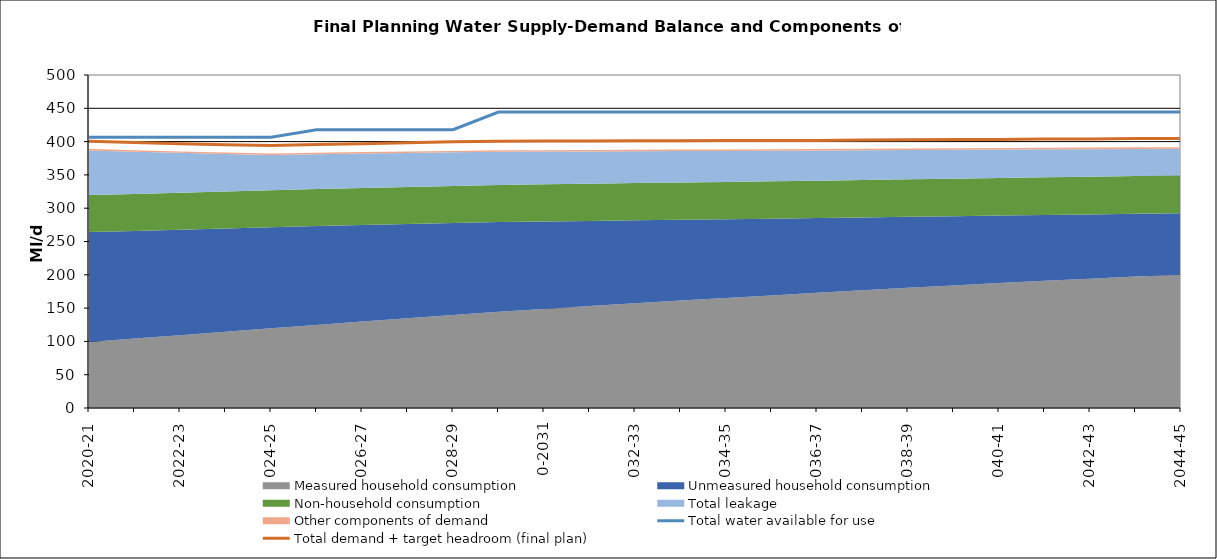
| Category | Total water available for use | Total demand + target headroom (final plan) |
|---|---|---|
| 0 | 406.688 | 400.59 |
| 1 | 406.688 | 398.657 |
| 2 | 406.688 | 396.804 |
| 3 | 406.688 | 395.209 |
| 4 | 406.688 | 394.076 |
| 5 | 417.86 | 395.615 |
| 6 | 417.86 | 396.867 |
| 7 | 417.86 | 398.274 |
| 8 | 417.86 | 399.6 |
| 9 | 444.402 | 400.622 |
| 10 | 444.402 | 400.937 |
| 11 | 444.402 | 400.977 |
| 12 | 444.402 | 401.125 |
| 13 | 444.402 | 401.167 |
| 14 | 444.402 | 401.765 |
| 15 | 444.402 | 401.667 |
| 16 | 444.402 | 401.572 |
| 17 | 444.402 | 402.429 |
| 18 | 444.402 | 402.761 |
| 19 | 444.402 | 403.164 |
| 20 | 444.402 | 403.298 |
| 21 | 444.402 | 403.799 |
| 22 | 444.402 | 403.934 |
| 23 | 444.402 | 404.548 |
| 24 | 444.402 | 404.533 |